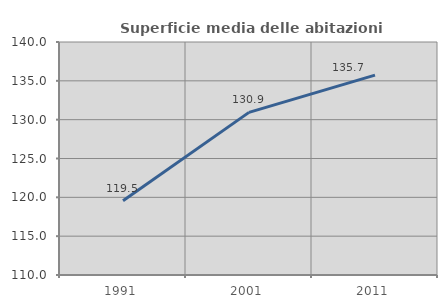
| Category | Superficie media delle abitazioni occupate |
|---|---|
| 1991.0 | 119.547 |
| 2001.0 | 130.941 |
| 2011.0 | 135.74 |